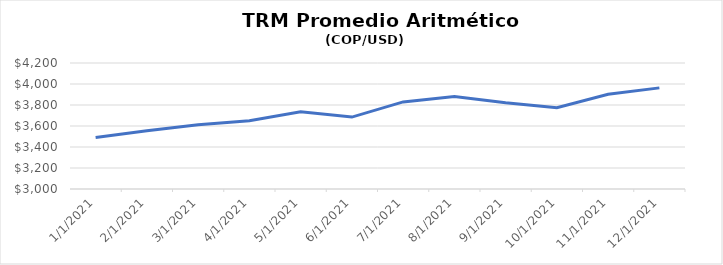
| Category | TRM Promedio Aritmético (COP/USD) |
|---|---|
| 1/1/21 | 3491.322 |
| 2/1/21 | 3554.504 |
| 3/1/21 | 3612.768 |
| 4/1/21 | 3650.776 |
| 5/1/21 | 3735.666 |
| 6/1/21 | 3685.043 |
| 7/1/21 | 3829.418 |
| 8/1/21 | 3881.184 |
| 9/1/21 | 3821.538 |
| 10/1/21 | 3773.384 |
| 11/1/21 | 3902.901 |
| 12/1/21 | 3963.134 |